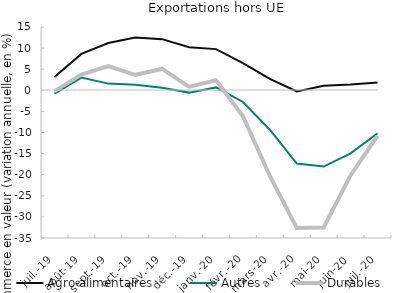
| Category | Agro-alimentaires | Autres | Durables |
|---|---|---|---|
| 2019-07-01 | 3.127 | -0.782 | -0.205 |
| 2019-08-01 | 8.617 | 3.006 | 3.723 |
| 2019-09-01 | 11.194 | 1.585 | 5.72 |
| 2019-10-01 | 12.524 | 1.323 | 3.668 |
| 2019-11-01 | 12.125 | 0.605 | 5.065 |
| 2019-12-01 | 10.186 | -0.547 | 0.804 |
| 2020-01-01 | 9.759 | 0.682 | 2.379 |
| 2020-02-01 | 6.444 | -2.76 | -6.16 |
| 2020-03-01 | 2.727 | -9.333 | -20.259 |
| 2020-04-01 | -0.279 | -17.368 | -32.643 |
| 2020-05-01 | 1.084 | -18.064 | -32.494 |
| 2020-06-01 | 1.349 | -14.953 | -20.114 |
| 2020-07-01 | 1.859 | -10.167 | -10.802 |